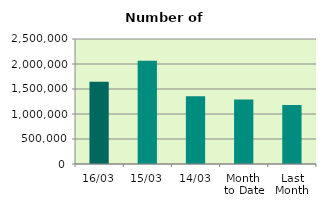
| Category | Series 0 |
|---|---|
| 16/03 | 1646744 |
| 15/03 | 2063026 |
| 14/03 | 1354086 |
| Month 
to Date | 1291652.667 |
| Last
Month | 1180310.4 |